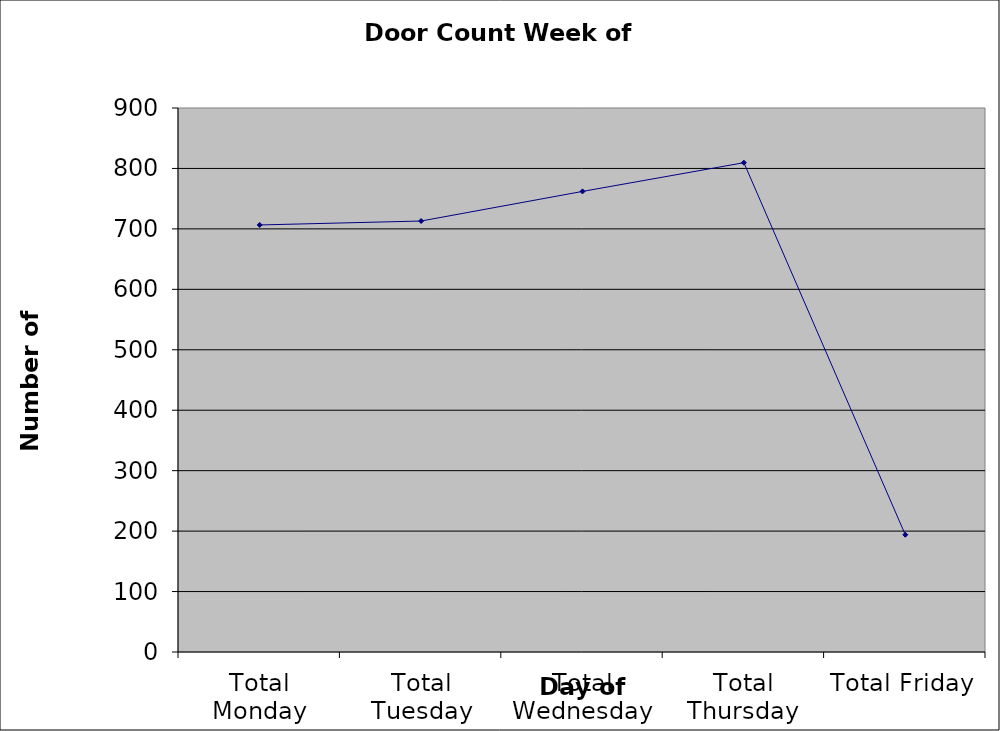
| Category | Series 0 |
|---|---|
| Total Monday | 706.5 |
| Total Tuesday | 713 |
| Total Wednesday | 762 |
| Total Thursday | 809.5 |
| Total Friday | 194 |